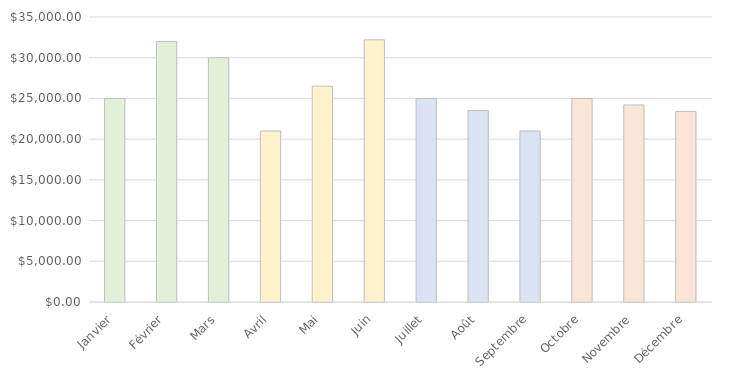
| Category | Series 0 |
|---|---|
| Janvier | 25000 |
| Février | 32000 |
| Mars | 30000 |
| Avril | 21000 |
| Mai | 26500 |
| Juin | 32200 |
| Juillet | 25000 |
| Août | 23500 |
| Septembre | 21000 |
| Octobre | 25000 |
| Novembre | 24200 |
| Décembre | 23400 |